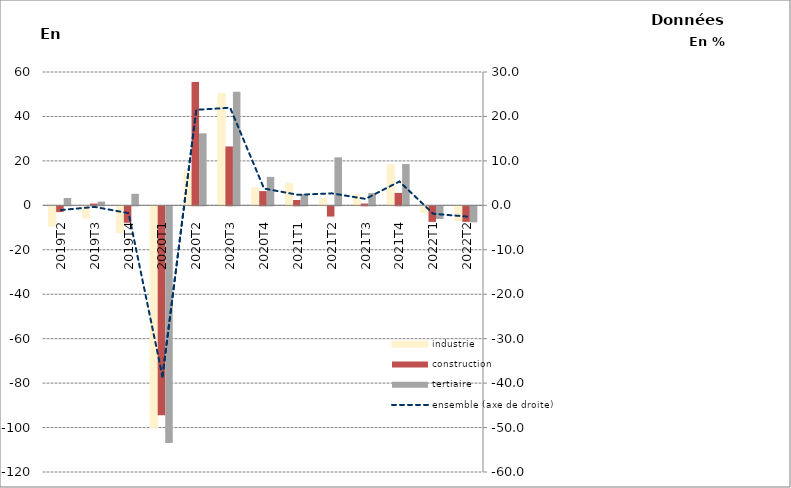
| Category | industrie | construction | tertiaire |
|---|---|---|---|
| 2019T2 | -9.1 | -2.6 | 3.3 |
| 2019T3 | -5.4 | 0.8 | 1.7 |
| 2019T4 | -12 | -7.4 | 5.2 |
| 2020T1 | -99.6 | -94 | -106.5 |
| 2020T2 | 14.8 | 55.5 | 32.4 |
| 2020T3 | 50.3 | 26.5 | 51.1 |
| 2020T4 | 7.9 | 6.4 | 12.8 |
| 2021T1 | 9.9 | 2.4 | 5.1 |
| 2021T2 | 3.1 | -4.6 | 21.6 |
| 2021T3 | 4.8 | 0.8 | 5.5 |
| 2021T4 | 18.2 | 5.6 | 18.6 |
| 2022T1 | -2.8 | -7 | -5.7 |
| 2022T2 | -6.6 | -7 | -7.2 |